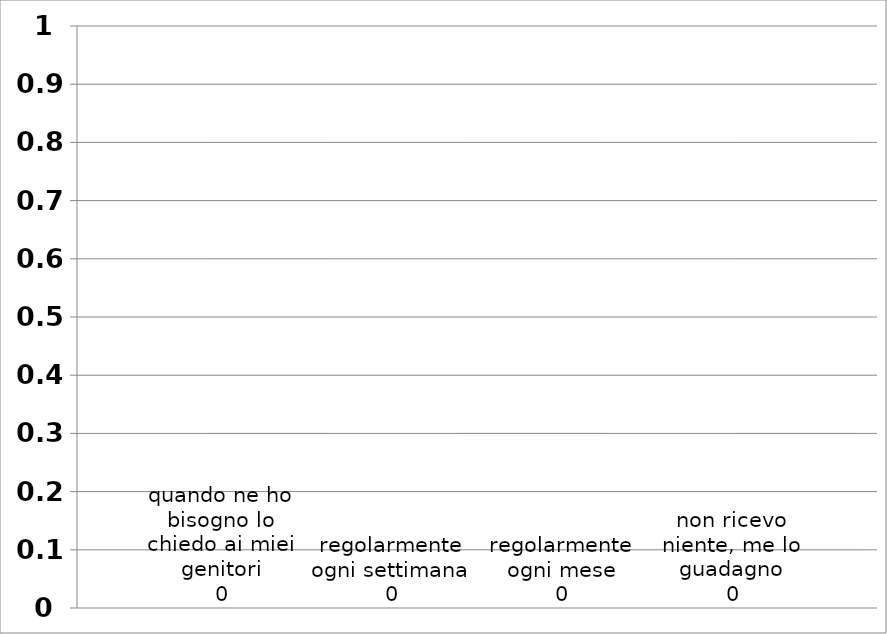
| Category | quando ne ho bisogno lo chiedo ai miei genitori | regolarmente ogni settimana | regolarmente ogni mese | non ricevo niente, me lo guadagno |
|---|---|---|---|---|
| 0 | 0 | 0 | 0 | 0 |